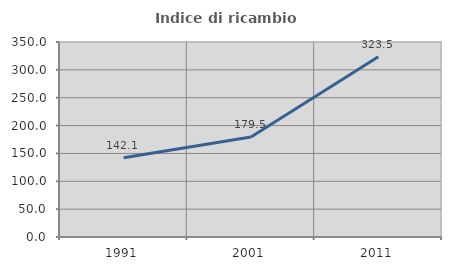
| Category | Indice di ricambio occupazionale  |
|---|---|
| 1991.0 | 142.105 |
| 2001.0 | 179.487 |
| 2011.0 | 323.529 |